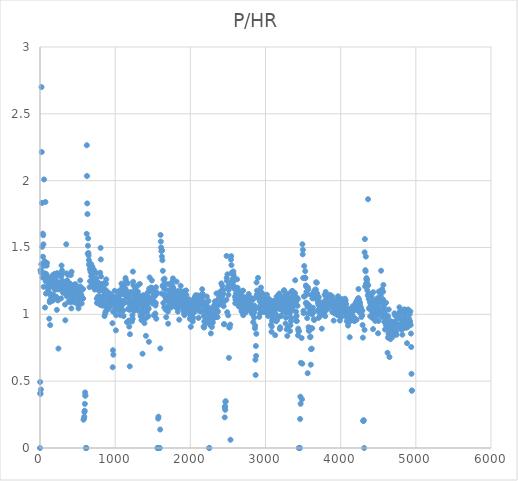
| Category | P/HR |
|---|---|
| 0.0 | 0 |
| 1.70000004768 | 0.494 |
| 3.40000009537 | 0.41 |
| 7.0 | 0.405 |
| 8.0 | 1.329 |
| 10.0 | 1.329 |
| 12.0 | 1.312 |
| 12.5999999046 | 0.438 |
| 17.0 | 1.375 |
| 19.7999999523 | 2.7 |
| 23.4000000954 | 2.214 |
| 26.5999999046 | 1.833 |
| 30.0 | 1.505 |
| 33.0999999046 | 1.276 |
| 36.2999999523 | 1.604 |
| 39.5999999046 | 1.431 |
| 42.4000000954 | 1.592 |
| 45.5999999046 | 1.524 |
| 48.5999999046 | 1.206 |
| 51.5999999046 | 1.364 |
| 54.4000000954 | 2.009 |
| 57.5999999046 | 1.366 |
| 60.5999999046 | 1.398 |
| 64.0 | 1.307 |
| 67.4000000954 | 1.051 |
| 72.0999999046 | 1.84 |
| 75.5999999046 | 1.248 |
| 79.2000000477 | 1.155 |
| 82.4000000954 | 1.302 |
| 85.5999999046 | 1.274 |
| 89.0 | 1.364 |
| 92.2000000477 | 1.385 |
| 95.5999999046 | 1.25 |
| 99.0 | 1.276 |
| 102.0 | 1.282 |
| 105.400000095 | 1.23 |
| 108.799999952 | 1.181 |
| 112.0 | 1.266 |
| 115.599999905 | 1.198 |
| 119.0 | 1.21 |
| 123.099999905 | 0.967 |
| 126.0 | 1.262 |
| 129.200000048 | 1.09 |
| 132.599999905 | 1.106 |
| 135.799999952 | 0.919 |
| 139.0 | 1.153 |
| 142.400000095 | 1.138 |
| 145.799999952 | 1.24 |
| 149.200000048 | 1.099 |
| 153.099999905 | 1.208 |
| 156.200000048 | 1.109 |
| 159.599999905 | 1.237 |
| 163.0 | 1.118 |
| 166.200000048 | 1.292 |
| 169.400000095 | 1.258 |
| 172.799999952 | 1.104 |
| 176.400000095 | 1.146 |
| 180.0 | 1.23 |
| 183.200000048 | 1.238 |
| 186.599999905 | 1.236 |
| 190.0 | 1.236 |
| 193.400000095 | 1.303 |
| 196.799999952 | 1.183 |
| 200.200000048 | 1.275 |
| 203.599999905 | 1.286 |
| 207.200000048 | 1.227 |
| 210.599999905 | 1.208 |
| 214.200000048 | 1.132 |
| 217.599999905 | 1.25 |
| 221.0 | 1.208 |
| 224.400000095 | 1.033 |
| 228.099999905 | 1.308 |
| 231.299999952 | 1.187 |
| 234.799999952 | 1.194 |
| 238.400000095 | 1.104 |
| 242.0 | 1.112 |
| 245.400000095 | 0.744 |
| 249.099999905 | 1.232 |
| 252.299999952 | 1.301 |
| 255.799999952 | 1.187 |
| 259.400000095 | 1.203 |
| 262.799999952 | 1.287 |
| 266.200000048 | 1.293 |
| 269.599999905 | 1.24 |
| 273.099999905 | 1.216 |
| 276.599999905 | 1.19 |
| 280.0 | 1.119 |
| 283.400000095 | 1.286 |
| 286.599999905 | 1.365 |
| 290.0 | 1.302 |
| 293.200000048 | 1.328 |
| 296.400000095 | 1.308 |
| 300.099999905 | 1.25 |
| 303.200000048 | 1.218 |
| 306.400000095 | 1.163 |
| 309.799999952 | 1.244 |
| 313.200000048 | 1.163 |
| 316.599999905 | 1.163 |
| 319.799999952 | 1.17 |
| 323.200000048 | 1.243 |
| 326.400000095 | 1.222 |
| 330.099999905 | 1.199 |
| 333.299999952 | 1.074 |
| 336.799999952 | 0.956 |
| 340.200000048 | 1.173 |
| 343.799999952 | 1.173 |
| 343.799999952 | 1.185 |
| 343.799999952 | 1.185 |
| 349.400000095 | 1.524 |
| 352.599999905 | 1.306 |
| 355.799999952 | 1.135 |
| 358.799999952 | 1.213 |
| 362.200000048 | 1.254 |
| 365.599999905 | 1.192 |
| 369.099999905 | 1.143 |
| 372.599999905 | 1.296 |
| 376.0 | 1.175 |
| 379.400000095 | 1.094 |
| 382.799999952 | 1.141 |
| 386.0 | 1.188 |
| 389.599999905 | 1.155 |
| 393.099999905 | 1.18 |
| 396.200000048 | 1.101 |
| 399.599999905 | 1.231 |
| 403.0 | 1.168 |
| 406.400000095 | 1.099 |
| 407.700000048 | 1.099 |
| 409.0 | 1.091 |
| 410.200000048 | 1.293 |
| 413.599999905 | 1.194 |
| 417.099999905 | 1.044 |
| 420.099999905 | 1.319 |
| 423.299999952 | 1.207 |
| 426.400000095 | 1.148 |
| 429.599999905 | 1.141 |
| 433.0 | 1.141 |
| 436.200000048 | 1.11 |
| 439.400000095 | 1.163 |
| 442.799999952 | 1.134 |
| 446.200000048 | 1.159 |
| 449.599999905 | 1.098 |
| 453.099999905 | 1.216 |
| 456.299999952 | 1.09 |
| 459.599999905 | 1.222 |
| 462.799999952 | 1.222 |
| 466.299999952 | 1.206 |
| 469.400000095 | 1.197 |
| 472.799999952 | 1.225 |
| 476.0 | 1.165 |
| 479.299999952 | 1.144 |
| 482.599999905 | 1.194 |
| 486.099999905 | 1.171 |
| 489.200000048 | 1.137 |
| 492.400000095 | 1.209 |
| 495.799999952 | 1.18 |
| 499.099999905 | 1.094 |
| 502.400000095 | 1.072 |
| 505.700000048 | 1.188 |
| 509.0 | 1.139 |
| 512.5 | 1.044 |
| 515.599999905 | 1.119 |
| 519.099999905 | 1.083 |
| 522.200000048 | 1.075 |
| 525.599999905 | 1.127 |
| 528.799999952 | 1.127 |
| 532.099999905 | 1.172 |
| 535.200000048 | 1.254 |
| 538.5 | 1.207 |
| 541.599999905 | 1.156 |
| 544.900000095 | 1.132 |
| 548.0 | 1.119 |
| 551.5 | 1.141 |
| 554.599999905 | 1.081 |
| 558.099999905 | 1.119 |
| 558.099999905 | 1.119 |
| 558.099999905 | 1.119 |
| 572.599999905 | 1.119 |
| 572.599999905 | 1.119 |
| 572.599999905 | 1.189 |
| 579.200000048 | 0.212 |
| 585.200000048 | 0.22 |
| 589.0 | 0.234 |
| 591.0 | 0.269 |
| 594.400000095 | 0.279 |
| 596.700000048 | 0.33 |
| 600.599999905 | 0.416 |
| 602.599999905 | 0.392 |
| 604.200000048 | 0.392 |
| 611.0 | 0 |
| 612.0 | 0 |
| 616.650000095 | 0 |
| 621.299999952 | 1.602 |
| 623.099999905 | 2.265 |
| 624.900000095 | 2.035 |
| 628.099999905 | 1.83 |
| 631.299999952 | 1.75 |
| 634.900000095 | 1.455 |
| 637.900000095 | 1.513 |
| 641.0 | 1.568 |
| 644.099999905 | 1.459 |
| 647.200000048 | 1.44 |
| 650.299999952 | 1.406 |
| 653.5 | 1.369 |
| 656.700000048 | 1.379 |
| 659.900000095 | 1.203 |
| 663.099999905 | 1.338 |
| 666.099999905 | 1.248 |
| 669.099999905 | 1.366 |
| 672.099999905 | 1.319 |
| 675.299999952 | 1.35 |
| 678.299999952 | 1.377 |
| 681.5 | 1.286 |
| 684.5 | 1.31 |
| 687.700000048 | 1.215 |
| 690.700000048 | 1.352 |
| 693.700000048 | 1.359 |
| 696.900000095 | 1.349 |
| 700.099999905 | 1.299 |
| 703.099999905 | 1.25 |
| 706.299999952 | 1.255 |
| 709.299999952 | 1.336 |
| 712.299999952 | 1.26 |
| 715.299999952 | 1.333 |
| 718.5 | 1.225 |
| 721.299999952 | 1.265 |
| 724.5 | 1.199 |
| 727.5 | 1.185 |
| 730.5 | 1.211 |
| 733.5 | 1.224 |
| 736.5 | 1.25 |
| 739.5 | 1.229 |
| 742.5 | 1.261 |
| 746.0 | 1.237 |
| 749.0 | 1.268 |
| 752.0 | 1.309 |
| 755.0 | 1.118 |
| 758.0 | 1.085 |
| 761.0 | 1.19 |
| 764.0 | 1.243 |
| 767.099999905 | 1.125 |
| 770.099999905 | 1.132 |
| 773.200000048 | 1.184 |
| 776.299999952 | 1.183 |
| 779.5 | 1.124 |
| 782.5 | 1.196 |
| 785.700000048 | 1.175 |
| 788.700000048 | 1.136 |
| 791.700000048 | 1.182 |
| 794.700000048 | 1.221 |
| 797.700000048 | 1.072 |
| 800.5 | 1.311 |
| 803.5 | 1.219 |
| 806.299999952 | 1.497 |
| 809.0 | 1.411 |
| 812.0 | 1.283 |
| 815.0 | 1.229 |
| 818.0 | 1.097 |
| 821.0 | 1.181 |
| 824.099999905 | 1.109 |
| 827.099999905 | 1.194 |
| 830.299999952 | 1.065 |
| 833.299999952 | 1.219 |
| 836.5 | 1.097 |
| 839.5 | 1.2 |
| 842.700000048 | 1.096 |
| 845.900000095 | 1.135 |
| 849.099999905 | 1.141 |
| 852.299999952 | 1.232 |
| 855.299999952 | 1.167 |
| 858.5 | 0.987 |
| 861.700000048 | 1.064 |
| 864.900000095 | 1.083 |
| 868.099999905 | 1.006 |
| 871.299999952 | 1.019 |
| 874.5 | 1.182 |
| 878.0 | 1.229 |
| 881.0 | 1.261 |
| 884.099999905 | 1.092 |
| 887.299999952 | 1.033 |
| 890.5 | 1.137 |
| 893.900000095 | 1.072 |
| 896.900000095 | 1.105 |
| 900.099999905 | 1.078 |
| 903.299999952 | 1.163 |
| 906.5 | 1.039 |
| 909.700000048 | 1.162 |
| 912.700000048 | 1.097 |
| 915.900000095 | 1.118 |
| 919.099999905 | 1.118 |
| 922.299999952 | 1.111 |
| 925.5 | 1.078 |
| 929.0 | 1.072 |
| 932.0 | 1.092 |
| 935.099999905 | 1.059 |
| 938.200000048 | 1.098 |
| 941.299999952 | 1.15 |
| 944.5 | 1.105 |
| 947.700000048 | 1.131 |
| 950.900000095 | 1.099 |
| 954.099999905 | 1.093 |
| 957.299999952 | 1.067 |
| 960.700000048 | 1.134 |
| 963.900000095 | 0.933 |
| 967.299999952 | 0.604 |
| 970.299999952 | 0.732 |
| 973.299999952 | 1.02 |
| 976.5 | 0.698 |
| 980.0 | 1.081 |
| 983.200000048 | 1.095 |
| 986.5 | 1.109 |
| 989.700000048 | 1.027 |
| 992.900000095 | 1.176 |
| 996.099999905 | 1.122 |
| 999.5 | 1.128 |
| 1002.70000005 | 1.108 |
| 1005.9000001 | 1.04 |
| 1009.0999999 | 0.88 |
| 1012.5 | 0.993 |
| 1016.0 | 1.101 |
| 1019.0 | 1.06 |
| 1022.20000005 | 1.114 |
| 1025.5 | 1.094 |
| 1028.70000005 | 1.121 |
| 1031.9000001 | 1.107 |
| 1035.0999999 | 1.141 |
| 1038.29999995 | 1.169 |
| 1041.70000005 | 1.054 |
| 1044.9000001 | 1.141 |
| 1048.0999999 | 1.121 |
| 1051.29999995 | 1.04 |
| 1054.5 | 1.027 |
| 1058.0 | 1.177 |
| 1061.0 | 1.075 |
| 1064.29999995 | 1.171 |
| 1067.5 | 1.075 |
| 1070.70000005 | 0.993 |
| 1073.9000001 | 1.103 |
| 1077.0999999 | 1.15 |
| 1080.29999995 | 1.048 |
| 1083.5 | 1.23 |
| 1086.70000005 | 1.101 |
| 1089.9000001 | 1.067 |
| 1093.0999999 | 1.073 |
| 1096.29999995 | 1.2 |
| 1099.5 | 1.207 |
| 1103.0 | 1.173 |
| 1106.0 | 1.027 |
| 1109.0999999 | 1.1 |
| 1112.29999995 | 0.987 |
| 1115.5999999 | 1.207 |
| 1118.70000005 | 1.174 |
| 1121.9000001 | 1.148 |
| 1125.0999999 | 1.148 |
| 1128.4000001 | 1.087 |
| 1131.5 | 1.173 |
| 1134.79999995 | 1.193 |
| 1137.9000001 | 1.272 |
| 1141.20000005 | 1.257 |
| 1144.5 | 1.237 |
| 1148.0 | 1.158 |
| 1151.0 | 1.144 |
| 1154.0999999 | 1.123 |
| 1157.5 | 0.942 |
| 1160.79999995 | 1.171 |
| 1163.9000001 | 1.139 |
| 1167.20000005 | 1.232 |
| 1170.70000005 | 1.04 |
| 1174.20000005 | 0.947 |
| 1177.29999995 | 1.139 |
| 1181.0 | 1.086 |
| 1184.0 | 0.954 |
| 1187.29999995 | 0.908 |
| 1190.70000005 | 1.033 |
| 1193.9000001 | 0.611 |
| 1197.20000005 | 0.851 |
| 1200.4000001 | 1.06 |
| 1203.5999999 | 1.107 |
| 1206.70000005 | 1.053 |
| 1210.0 | 1.167 |
| 1213.20000005 | 1.066 |
| 1216.4000001 | 1.053 |
| 1219.5999999 | 1.08 |
| 1223.0 | 0.947 |
| 1226.0999999 | 1.047 |
| 1229.4000001 | 0.993 |
| 1232.79999995 | 0.966 |
| 1236.0 | 1.32 |
| 1239.20000005 | 1.243 |
| 1242.5999999 | 1.216 |
| 1245.79999995 | 1.134 |
| 1249.20000005 | 1.086 |
| 1252.5999999 | 1.026 |
| 1256.0 | 1.145 |
| 1259.0 | 1.171 |
| 1262.5999999 | 1.112 |
| 1266.0 | 1.192 |
| 1269.20000005 | 1.145 |
| 1272.5999999 | 1.079 |
| 1276.0 | 1.205 |
| 1279.20000005 | 1.178 |
| 1282.5 | 1.052 |
| 1285.5999999 | 1.137 |
| 1289.0 | 1.138 |
| 1292.4000001 | 1.059 |
| 1295.79999995 | 1.105 |
| 1299.0 | 1.216 |
| 1302.20000005 | 1.169 |
| 1305.4000001 | 1.117 |
| 1308.79999995 | 1.071 |
| 1312.0 | 1.026 |
| 1315.20000005 | 1.097 |
| 1318.4000001 | 1.124 |
| 1321.5999999 | 1.098 |
| 1325.0 | 1.078 |
| 1328.0 | 1.227 |
| 1331.4000001 | 1.136 |
| 1334.5999999 | 1.123 |
| 1337.79999995 | 0.987 |
| 1341.0 | 1.071 |
| 1344.4000001 | 1.076 |
| 1347.5999999 | 1.064 |
| 1350.79999995 | 0.956 |
| 1353.79999995 | 1.127 |
| 1357.20000005 | 1.013 |
| 1360.4000001 | 1 |
| 1364.0 | 0.705 |
| 1367.0 | 0.962 |
| 1370.0 | 1.039 |
| 1373.0999999 | 1.058 |
| 1376.4000001 | 1.144 |
| 1379.4000001 | 1.033 |
| 1382.5999999 | 1.132 |
| 1386.0 | 1.039 |
| 1389.20000005 | 0.934 |
| 1392.5999999 | 1.026 |
| 1395.5999999 | 1.092 |
| 1399.0 | 1.112 |
| 1402.20000005 | 1.107 |
| 1405.5999999 | 1.054 |
| 1409.0 | 0.839 |
| 1412.0999999 | 0.973 |
| 1415.5999999 | 1.014 |
| 1419.0 | 1.014 |
| 1422.20000005 | 1.074 |
| 1425.79999995 | 1.087 |
| 1429.0 | 1.054 |
| 1432.4000001 | 1.162 |
| 1435.5999999 | 1.128 |
| 1439.0 | 1.047 |
| 1442.4000001 | 0.986 |
| 1445.5999999 | 1.041 |
| 1448.79999995 | 0.795 |
| 1452.0 | 1.192 |
| 1455.4000001 | 1.11 |
| 1458.5999999 | 1.276 |
| 1461.79999995 | 1.11 |
| 1465.0 | 1.171 |
| 1468.4000001 | 1.123 |
| 1472.0 | 1.11 |
| 1475.0 | 1.11 |
| 1478.5999999 | 1.2 |
| 1481.79999995 | 1.193 |
| 1485.0 | 1.186 |
| 1488.4000001 | 1.253 |
| 1491.5999999 | 1.197 |
| 1494.79999995 | 1.081 |
| 1498.0 | 1.115 |
| 1501.20000005 | 1.107 |
| 1504.4000001 | 1.087 |
| 1508.0 | 1.134 |
| 1511.0 | 1.173 |
| 1514.20000005 | 0.993 |
| 1517.5999999 | 1.147 |
| 1520.79999995 | 1.16 |
| 1524.0 | 1.086 |
| 1527.4000001 | 0.993 |
| 1530.5999999 | 1.138 |
| 1533.79999995 | 1.007 |
| 1537.0 | 1.066 |
| 1540.20000005 | 1.086 |
| 1543.5999999 | 1.203 |
| 1547.0 | 0.967 |
| 1550.0 | 1.156 |
| 1553.0999999 | 1.156 |
| 1553.0999999 | 1.156 |
| 1553.0999999 | 1.163 |
| 1563.29999995 | 0 |
| 1564.5 | 0 |
| 1565.70000005 | 0 |
| 1566.70000005 | 0 |
| 1569.5 | 0 |
| 1572.5 | 0.22 |
| 1576.0999999 | 0.234 |
| 1589.5 | 0 |
| 1594.3499999 | 0 |
| 1599.20000005 | 0.138 |
| 1600.20000005 | 0.745 |
| 1604.0 | 1.594 |
| 1607.5999999 | 1.545 |
| 1611.0 | 1.5 |
| 1614.4000001 | 1.473 |
| 1617.79999995 | 1.155 |
| 1621.0 | 1.432 |
| 1624.4000001 | 1.479 |
| 1627.9000001 | 1.405 |
| 1631.0 | 1.211 |
| 1634.20000005 | 1.325 |
| 1637.5999999 | 1.219 |
| 1640.79999995 | 1.085 |
| 1644.0 | 1.26 |
| 1647.20000005 | 1.212 |
| 1650.4000001 | 1.194 |
| 1653.79999995 | 1.052 |
| 1656.79999995 | 1.267 |
| 1660.20000005 | 1.147 |
| 1663.4000001 | 1.131 |
| 1666.4000001 | 1.232 |
| 1669.9000001 | 1.036 |
| 1672.9000001 | 1.184 |
| 1675.9000001 | 1.113 |
| 1679.0999999 | 0.979 |
| 1682.20000005 | 1.105 |
| 1685.4000001 | 1.139 |
| 1688.5999999 | 1.118 |
| 1692.0 | 1.042 |
| 1695.0 | 1.126 |
| 1698.4000001 | 1.056 |
| 1701.5999999 | 1.021 |
| 1705.0 | 0.93 |
| 1708.0 | 1.225 |
| 1711.4000001 | 1.12 |
| 1714.9000001 | 1.063 |
| 1717.9000001 | 1.092 |
| 1721.0999999 | 1.134 |
| 1724.20000005 | 1.105 |
| 1727.4000001 | 1.168 |
| 1730.5999999 | 1.183 |
| 1733.79999995 | 1.077 |
| 1737.0 | 1.049 |
| 1740.4000001 | 1.084 |
| 1743.5999999 | 1.154 |
| 1746.79999995 | 1.077 |
| 1750.0 | 1.077 |
| 1753.20000005 | 1.239 |
| 1756.4000001 | 1.211 |
| 1759.9000001 | 1.217 |
| 1762.9000001 | 1.189 |
| 1766.0 | 1.146 |
| 1769.0999999 | 1.269 |
| 1772.4000001 | 1.199 |
| 1775.5999999 | 1.155 |
| 1778.5999999 | 1.188 |
| 1781.79999995 | 1.155 |
| 1785.20000005 | 1.122 |
| 1788.4000001 | 1.101 |
| 1791.5999999 | 1.141 |
| 1794.79999995 | 1.068 |
| 1798.0 | 1.088 |
| 1801.20000005 | 1.143 |
| 1804.9000001 | 1.054 |
| 1807.9000001 | 1.136 |
| 1811.0999999 | 1.088 |
| 1814.20000005 | 1.054 |
| 1817.20000005 | 1.245 |
| 1820.5999999 | 1.102 |
| 1823.5999999 | 1.156 |
| 1826.79999995 | 1.088 |
| 1830.0 | 1.121 |
| 1833.20000005 | 1.02 |
| 1836.4000001 | 1.128 |
| 1839.5999999 | 1.174 |
| 1842.79999995 | 1.087 |
| 1846.0 | 1.114 |
| 1849.29999995 | 1.054 |
| 1852.4000001 | 0.96 |
| 1855.9000001 | 1.147 |
| 1858.9000001 | 1.1 |
| 1861.9000001 | 1.094 |
| 1865.0999999 | 1.128 |
| 1868.29999995 | 1.127 |
| 1871.20000005 | 1.213 |
| 1874.5 | 1.173 |
| 1877.5999999 | 1.067 |
| 1880.5999999 | 1.113 |
| 1883.79999995 | 1.16 |
| 1887.0 | 1.153 |
| 1890.0 | 1.113 |
| 1893.20000005 | 1.133 |
| 1896.4000001 | 1.073 |
| 1899.5999999 | 1.159 |
| 1902.79999995 | 1.1 |
| 1906.0 | 1.033 |
| 1909.0 | 1.113 |
| 1912.20000005 | 1.093 |
| 1915.4000001 | 1.007 |
| 1918.9000001 | 1.173 |
| 1921.9000001 | 0.993 |
| 1925.0 | 1.04 |
| 1928.20000005 | 1.106 |
| 1931.4000001 | 1.06 |
| 1934.5999999 | 1.113 |
| 1937.79999995 | 1.099 |
| 1941.20000005 | 1.093 |
| 1944.4000001 | 1.179 |
| 1947.70000005 | 1.145 |
| 1950.79999995 | 1.092 |
| 1954.0999999 | 1.032 |
| 1957.20000005 | 1.065 |
| 1960.4000001 | 1.045 |
| 1963.9000001 | 1.026 |
| 1966.9000001 | 1.059 |
| 1970.0999999 | 1.059 |
| 1973.29999995 | 1.053 |
| 1976.5999999 | 1.046 |
| 1979.70000005 | 1.059 |
| 1983.0 | 1.112 |
| 1986.29999995 | 1.06 |
| 1989.5 | 1 |
| 1992.70000005 | 0.966 |
| 1996.0 | 1.088 |
| 1999.29999995 | 1.02 |
| 2002.4000001 | 1.067 |
| 2005.9000001 | 0.907 |
| 2008.9000001 | 1.053 |
| 2011.9000001 | 1.073 |
| 2015.0999999 | 1.033 |
| 2018.5 | 1.06 |
| 2021.9000001 | 1.054 |
| 2025.0999999 | 1.101 |
| 2028.29999995 | 0.98 |
| 2031.70000005 | 0.946 |
| 2034.70000005 | 1.107 |
| 2038.0999999 | 0.973 |
| 2041.5 | 1.054 |
| 2044.9000001 | 1.027 |
| 2047.9000001 | 1.014 |
| 2051.29999995 | 1.068 |
| 2054.5 | 1.041 |
| 2057.70000005 | 1.068 |
| 2060.9000001 | 1.13 |
| 2064.29999995 | 1.082 |
| 2067.5 | 1.041 |
| 2070.70000005 | 1.143 |
| 2073.9000001 | 1.108 |
| 2077.0999999 | 1.115 |
| 2080.29999995 | 1.115 |
| 2083.5 | 1.074 |
| 2086.9000001 | 1.074 |
| 2090.0 | 1.054 |
| 2093.29999995 | 1.088 |
| 2096.5 | 1.142 |
| 2099.70000005 | 1.101 |
| 2102.9000001 | 1.101 |
| 2106.0999999 | 1.081 |
| 2109.29999995 | 0.973 |
| 2112.70000005 | 1.027 |
| 2115.9000001 | 1.054 |
| 2119.29999995 | 1.116 |
| 2122.5 | 1.109 |
| 2125.9000001 | 1.135 |
| 2128.9000001 | 1.101 |
| 2132.0 | 1.061 |
| 2135.29999995 | 1.081 |
| 2138.70000005 | 1.02 |
| 2141.9000001 | 1.073 |
| 2145.0999999 | 1.087 |
| 2148.29999995 | 1.146 |
| 2151.5 | 1.127 |
| 2154.70000005 | 1.073 |
| 2157.70000005 | 1.188 |
| 2160.9000001 | 1.153 |
| 2164.29999995 | 1.147 |
| 2167.5 | 1.087 |
| 2170.9000001 | 1.099 |
| 2173.9000001 | 1.026 |
| 2177.0 | 0.908 |
| 2180.0999999 | 0.987 |
| 2183.5 | 0.901 |
| 2186.70000005 | 0.947 |
| 2190.0999999 | 1.026 |
| 2193.29999995 | 0.947 |
| 2196.5 | 1.033 |
| 2199.70000005 | 1.059 |
| 2202.9000001 | 0.934 |
| 2206.0999999 | 1.072 |
| 2209.29999995 | 1.079 |
| 2212.5 | 1.046 |
| 2215.9000001 | 1.033 |
| 2218.9000001 | 1.133 |
| 2222.0 | 1.04 |
| 2225.29999995 | 0.96 |
| 2228.29999995 | 1.013 |
| 2231.5 | 1.027 |
| 2234.9000001 | 0.966 |
| 2238.0999999 | 1.053 |
| 2241.29999995 | 1.1 |
| 2244.70000005 | 1.007 |
| 2247.9000001 | 1.04 |
| 2251.29999995 | 0 |
| 2251.29999995 | 0 |
| 2251.29999995 | 1 |
| 2257.29999995 | 1.007 |
| 2260.5 | 0.926 |
| 2263.5 | 0.98 |
| 2266.9000001 | 0.918 |
| 2269.9000001 | 1 |
| 2273.29999995 | 0.857 |
| 2276.5 | 1.007 |
| 2279.70000005 | 1 |
| 2283.0999999 | 0.94 |
| 2286.5 | 0.905 |
| 2289.70000005 | 1.014 |
| 2292.9000001 | 0.98 |
| 2296.0999999 | 1.02 |
| 2299.29999995 | 0.939 |
| 2302.9000001 | 1.054 |
| 2305.9000001 | 0.986 |
| 2309.0999999 | 1.014 |
| 2312.5 | 1.014 |
| 2315.70000005 | 0.973 |
| 2318.9000001 | 1.068 |
| 2322.0999999 | 1.007 |
| 2325.5 | 0.986 |
| 2328.70000005 | 1.097 |
| 2332.0999999 | 1.097 |
| 2335.5 | 1.021 |
| 2338.9000001 | 1.02 |
| 2341.9000001 | 1.081 |
| 2345.0999999 | 0.98 |
| 2348.29999995 | 1.156 |
| 2351.70000005 | 1.034 |
| 2354.9000001 | 1.061 |
| 2358.0999999 | 1.02 |
| 2361.5 | 0.98 |
| 2364.70000005 | 1.095 |
| 2367.9000001 | 1.021 |
| 2371.0999999 | 1.083 |
| 2374.29999995 | 1.076 |
| 2377.5 | 1.104 |
| 2380.9000001 | 1.124 |
| 2384.0999999 | 1.116 |
| 2387.5 | 1.095 |
| 2390.70000005 | 1.149 |
| 2393.70000005 | 1.081 |
| 2396.9000001 | 1.169 |
| 2399.9000001 | 1.134 |
| 2402.9000001 | 1.074 |
| 2405.9000001 | 1.135 |
| 2409.0999999 | 1.15 |
| 2412.29999995 | 1.231 |
| 2415.29999995 | 1.103 |
| 2418.5 | 1.131 |
| 2421.5 | 1.179 |
| 2424.70000005 | 1.214 |
| 2427.70000005 | 1.143 |
| 2430.9000001 | 1.177 |
| 2433.9000001 | 1.184 |
| 2437.0999999 | 1.156 |
| 2440.29999995 | 1.088 |
| 2443.5 | 1.061 |
| 2446.9000001 | 0.926 |
| 2452.04999995 | 0.926 |
| 2457.20000005 | 0.229 |
| 2458.70000005 | 0.306 |
| 2460.3499999 | 0.306 |
| 2462.0 | 0.312 |
| 2464.4000001 | 0.286 |
| 2467.4000001 | 0.345 |
| 2469.5999999 | 0.35 |
| 2480.4000001 | 1.109 |
| 2482.20000005 | 1.437 |
| 2484.0 | 1.273 |
| 2487.4000001 | 1.25 |
| 2490.5999999 | 1.016 |
| 2493.79999995 | 1.299 |
| 2497.0 | 1.195 |
| 2500.20000005 | 1.209 |
| 2503.9000001 | 0.992 |
| 2506.79999995 | 1.146 |
| 2510.0999999 | 1.183 |
| 2513.4000001 | 0.674 |
| 2516.5999999 | 0.902 |
| 2523.70000005 | 0.902 |
| 2530.79999995 | 0.923 |
| 2534.0 | 0.062 |
| 2537.20000005 | 1.232 |
| 2540.5999999 | 1.41 |
| 2543.79999995 | 1.435 |
| 2547.0 | 1.368 |
| 2550.20000005 | 1.238 |
| 2553.4000001 | 1.312 |
| 2556.4000001 | 1.302 |
| 2559.79999995 | 1.262 |
| 2563.0 | 1.237 |
| 2566.0 | 1.205 |
| 2569.4000001 | 1.308 |
| 2572.79999995 | 1.321 |
| 2575.79999995 | 1.294 |
| 2578.79999995 | 1.21 |
| 2581.79999995 | 1.273 |
| 2584.9000001 | 1.255 |
| 2588.20000005 | 1.19 |
| 2591.4000001 | 1.196 |
| 2594.4000001 | 1.132 |
| 2597.5999999 | 1.083 |
| 2600.5999999 | 1.109 |
| 2603.5999999 | 1.122 |
| 2606.79999995 | 1.151 |
| 2610.0 | 1.13 |
| 2613.0 | 1.199 |
| 2616.20000005 | 1.163 |
| 2619.20000005 | 1.189 |
| 2622.4000001 | 1.262 |
| 2625.5999999 | 1.193 |
| 2628.5999999 | 1.199 |
| 2631.5999999 | 1.092 |
| 2634.5999999 | 1.144 |
| 2637.79999995 | 1.175 |
| 2640.79999995 | 1.123 |
| 2644.0 | 1.065 |
| 2647.0 | 1.058 |
| 2650.0 | 1.13 |
| 2653.20000005 | 1.129 |
| 2656.20000005 | 1.115 |
| 2659.20000005 | 1.148 |
| 2662.20000005 | 1.149 |
| 2665.4000001 | 1.123 |
| 2668.79999995 | 1.078 |
| 2671.79999995 | 1.11 |
| 2674.79999995 | 1.111 |
| 2677.79999995 | 1.053 |
| 2681.0999999 | 1.026 |
| 2684.4000001 | 1.02 |
| 2687.5999999 | 1.132 |
| 2690.79999995 | 1.066 |
| 2693.79999995 | 1.118 |
| 2697.0 | 1.176 |
| 2700.20000005 | 1.176 |
| 2703.5999999 | 0.993 |
| 2706.5999999 | 1.132 |
| 2709.79999995 | 1.086 |
| 2713.0 | 1.059 |
| 2716.20000005 | 1.072 |
| 2719.4000001 | 1.118 |
| 2722.9000001 | 1.052 |
| 2725.9000001 | 1.052 |
| 2728.9000001 | 1.078 |
| 2732.20000005 | 1.072 |
| 2735.4000001 | 1.013 |
| 2738.5999999 | 1.053 |
| 2742.0 | 1.06 |
| 2745.20000005 | 1.053 |
| 2748.20000005 | 1.026 |
| 2751.4000001 | 1.053 |
| 2754.5999999 | 1.099 |
| 2757.79999995 | 1.132 |
| 2761.0 | 1.06 |
| 2764.20000005 | 1.046 |
| 2767.20000005 | 1.113 |
| 2770.4000001 | 1.12 |
| 2773.9000001 | 1.073 |
| 2776.9000001 | 1.152 |
| 2780.0999999 | 1.073 |
| 2783.20000005 | 1.119 |
| 2786.4000001 | 1.099 |
| 2789.5999999 | 1.099 |
| 2792.5999999 | 1.111 |
| 2795.79999995 | 1.124 |
| 2799.0 | 1.032 |
| 2802.20000005 | 1.077 |
| 2805.4000001 | 1.117 |
| 2808.5999999 | 1.058 |
| 2811.79999995 | 1.104 |
| 2815.0 | 1.065 |
| 2818.20000005 | 1.052 |
| 2821.4000001 | 1.006 |
| 2824.4000001 | 1.013 |
| 2827.9000001 | 1 |
| 2830.9000001 | 1.118 |
| 2834.0999999 | 1.111 |
| 2837.20000005 | 0.941 |
| 2840.20000005 | 1.013 |
| 2843.4000001 | 1.013 |
| 2846.5999999 | 1.02 |
| 2849.79999995 | 0.974 |
| 2853.0 | 1.066 |
| 2856.20000005 | 1.039 |
| 2859.4000001 | 0.895 |
| 2862.5999999 | 0.915 |
| 2865.79999995 | 0.66 |
| 2869.0 | 0.546 |
| 2872.0 | 0.763 |
| 2875.0 | 0.689 |
| 2878.0 | 0.854 |
| 2881.20000005 | 1.238 |
| 2884.4000001 | 1.145 |
| 2887.9000001 | 1.178 |
| 2890.9000001 | 1.151 |
| 2894.20000005 | 1.124 |
| 2897.4000001 | 1.131 |
| 2900.4000001 | 1.273 |
| 2903.5999999 | 1.168 |
| 2907.0 | 1.129 |
| 2910.20000005 | 1.129 |
| 2913.4000001 | 1.045 |
| 2916.79999995 | 0.981 |
| 2920.0 | 1.058 |
| 2923.20000005 | 1.097 |
| 2926.4000001 | 1.006 |
| 2929.9000001 | 1.039 |
| 2932.9000001 | 1.112 |
| 2936.20000005 | 1.126 |
| 2939.5999999 | 1.2 |
| 2942.79999995 | 1.127 |
| 2946.0 | 1.166 |
| 2949.20000005 | 1.02 |
| 2952.4000001 | 1.097 |
| 2955.5999999 | 1.058 |
| 2958.79999995 | 1.077 |
| 2962.0 | 1.019 |
| 2965.20000005 | 1.115 |
| 2968.20000005 | 1.108 |
| 2971.4000001 | 1.146 |
| 2974.9000001 | 1.115 |
| 2977.9000001 | 1.115 |
| 2980.9000001 | 1.019 |
| 2984.0 | 1.101 |
| 2987.0999999 | 1.075 |
| 2990.4000001 | 1.094 |
| 2993.5999999 | 1.019 |
| 2996.79999995 | 1.108 |
| 2999.79999995 | 1.089 |
| 3003.0 | 1.051 |
| 3006.20000005 | 1.096 |
| 3009.4000001 | 1.108 |
| 3012.5999999 | 1.064 |
| 3015.79999995 | 1.013 |
| 3019.0 | 1.146 |
| 3022.0 | 1.083 |
| 3025.20000005 | 1.071 |
| 3028.4000001 | 1.064 |
| 3031.9000001 | 1.051 |
| 3034.9000001 | 0.987 |
| 3038.0 | 1.045 |
| 3041.20000005 | 1.038 |
| 3044.5999999 | 1.032 |
| 3047.79999995 | 1.115 |
| 3051.0 | 1.108 |
| 3054.20000005 | 1.032 |
| 3057.4000001 | 1 |
| 3060.5 | 1.089 |
| 3063.5999999 | 1.045 |
| 3066.79999995 | 1.064 |
| 3070.0 | 1.026 |
| 3073.29999995 | 0.923 |
| 3076.4000001 | 0.987 |
| 3079.9000001 | 0.869 |
| 3083.0 | 0.908 |
| 3086.29999995 | 0.954 |
| 3089.4000001 | 1.099 |
| 3092.5 | 1.053 |
| 3095.79999995 | 1.053 |
| 3099.0999999 | 0.967 |
| 3102.4000001 | 1.007 |
| 3105.9000001 | 1.072 |
| 3109.0 | 1.033 |
| 3112.29999995 | 1.046 |
| 3115.9000001 | 1.039 |
| 3118.9000001 | 1.033 |
| 3122.0 | 1.072 |
| 3125.5 | 1.033 |
| 3128.5999999 | 0.844 |
| 3131.70000005 | 1.105 |
| 3134.79999995 | 1.065 |
| 3137.9000001 | 1 |
| 3141.0 | 0.948 |
| 3144.20000005 | 1.072 |
| 3147.5 | 1.132 |
| 3150.70000005 | 0.954 |
| 3153.5999999 | 1.116 |
| 3156.79999995 | 0.981 |
| 3159.9000001 | 0.968 |
| 3163.0 | 1.084 |
| 3166.0999999 | 1.143 |
| 3169.20000005 | 1.071 |
| 3172.4000001 | 1.098 |
| 3175.9000001 | 1.144 |
| 3178.9000001 | 1.137 |
| 3181.9000001 | 1.039 |
| 3185.0 | 1.156 |
| 3188.0999999 | 1.065 |
| 3191.20000005 | 0.89 |
| 3194.4000001 | 0.903 |
| 3197.70000005 | 1.065 |
| 3200.9000001 | 0.987 |
| 3203.9000001 | 1.097 |
| 3207.0999999 | 0.987 |
| 3210.0999999 | 1.083 |
| 3213.0999999 | 1.128 |
| 3216.29999995 | 1.058 |
| 3219.5 | 1.11 |
| 3222.70000005 | 1.052 |
| 3225.9000001 | 1.058 |
| 3229.0999999 | 1.026 |
| 3232.29999995 | 1.059 |
| 3235.5 | 1.092 |
| 3238.9000001 | 1.105 |
| 3241.9000001 | 1.02 |
| 3244.9000001 | 1.175 |
| 3247.9000001 | 1.181 |
| 3251.0999999 | 1.09 |
| 3254.0999999 | 1.057 |
| 3257.29999995 | 1.14 |
| 3260.29999995 | 1.082 |
| 3263.29999995 | 1.101 |
| 3266.5 | 0.931 |
| 3269.29999995 | 1.112 |
| 3272.29999995 | 0.975 |
| 3275.0 | 1.012 |
| 3278.0 | 1.019 |
| 3281.0 | 0.888 |
| 3283.9000001 | 1.031 |
| 3286.9000001 | 1.062 |
| 3289.9000001 | 0.839 |
| 3292.9000001 | 1.019 |
| 3295.9000001 | 1.062 |
| 3298.9000001 | 0.901 |
| 3301.9000001 | 1.154 |
| 3304.9000001 | 1.068 |
| 3307.5 | 1.074 |
| 3310.5 | 1.104 |
| 3313.9000001 | 1.118 |
| 3316.9000001 | 1.069 |
| 3319.9000001 | 1.05 |
| 3322.9000001 | 1.006 |
| 3326.0999999 | 0.875 |
| 3329.29999995 | 1.038 |
| 3332.29999995 | 0.918 |
| 3335.29999995 | 0.975 |
| 3338.5 | 0.949 |
| 3341.70000005 | 1.096 |
| 3344.9000001 | 1.077 |
| 3348.0999999 | 1.039 |
| 3351.29999995 | 1.174 |
| 3354.5 | 1.097 |
| 3357.5 | 1.103 |
| 3360.70000005 | 1.174 |
| 3363.70000005 | 1.135 |
| 3366.9000001 | 1.032 |
| 3369.9000001 | 1.096 |
| 3372.9000001 | 1.064 |
| 3376.0999999 | 1.09 |
| 3379.29999995 | 1.115 |
| 3382.5 | 1.134 |
| 3385.5 | 1.146 |
| 3388.9000001 | 1.134 |
| 3391.9000001 | 1.159 |
| 3394.9000001 | 1.255 |
| 3398.0 | 0.975 |
| 3401.0 | 1.127 |
| 3404.0999999 | 1.089 |
| 3407.29999995 | 1.019 |
| 3410.5 | 0.949 |
| 3413.70000005 | 0.987 |
| 3416.9000001 | 0.949 |
| 3419.9000001 | 1.121 |
| 3423.0999999 | 1.121 |
| 3426.29999995 | 1.064 |
| 3429.5 | 1.114 |
| 3432.5 | 0.843 |
| 3435.70000005 | 0.893 |
| 3438.9000001 | 0.881 |
| 3442.0999999 | 0.873 |
| 3442.0999999 | 0.873 |
| 3442.0999999 | 0 |
| 3453.9000001 | 0 |
| 3455.29999995 | 0 |
| 3456.70000005 | 0 |
| 3460.29999995 | 0.217 |
| 3464.0 | 0.384 |
| 3467.5 | 0.331 |
| 3470.9000001 | 0.637 |
| 3480.70000005 | 0.823 |
| 3485.54999995 | 0.365 |
| 3490.4000001 | 0.631 |
| 3491.0 | 1.524 |
| 3494.5999999 | 1.449 |
| 3498.0 | 1.482 |
| 3501.4000001 | 1.272 |
| 3504.79999995 | 1.026 |
| 3508.4000001 | 1.008 |
| 3512.0 | 1.134 |
| 3515.20000005 | 1.361 |
| 3518.5999999 | 1.133 |
| 3521.79999995 | 1.27 |
| 3525.0 | 1.274 |
| 3528.4000001 | 1.323 |
| 3531.79999995 | 1.271 |
| 3534.9000001 | 1.084 |
| 3538.0999999 | 1.216 |
| 3541.4000001 | 1.207 |
| 3544.5999999 | 1.168 |
| 3547.79999995 | 1.086 |
| 3551.20000005 | 1.15 |
| 3554.4000001 | 0.972 |
| 3557.5999999 | 1.056 |
| 3560.79999995 | 0.559 |
| 3563.79999995 | 1.201 |
| 3567.20000005 | 1.007 |
| 3570.0 | 1.186 |
| 3573.4000001 | 0.904 |
| 3576.20000005 | 0.878 |
| 3579.4000001 | 1.068 |
| 3582.79999995 | 0.878 |
| 3586.20000005 | 0.898 |
| 3589.5999999 | 0.891 |
| 3592.79999995 | 0.829 |
| 3595.79999995 | 1.034 |
| 3599.0 | 0.833 |
| 3602.79999995 | 0.623 |
| 3605.79999995 | 0.74 |
| 3608.5999999 | 1.145 |
| 3611.5999999 | 0.896 |
| 3614.79999995 | 0.743 |
| 3618.0 | 1 |
| 3621.20000005 | 0.895 |
| 3624.20000005 | 1.119 |
| 3627.4000001 | 1.014 |
| 3630.9000001 | 1.049 |
| 3634.0 | 1.014 |
| 3637.0999999 | 1.158 |
| 3640.4000001 | 1.151 |
| 3643.5999999 | 0.964 |
| 3647.0 | 0.957 |
| 3650.20000005 | 1.173 |
| 3653.4000001 | 1.174 |
| 3656.79999995 | 1.151 |
| 3660.20000005 | 1.184 |
| 3663.9000001 | 1.182 |
| 3666.9000001 | 1.132 |
| 3670.0999999 | 1.185 |
| 3673.20000005 | 1.24 |
| 3676.5999999 | 1.156 |
| 3679.79999995 | 1.149 |
| 3683.0 | 1.236 |
| 3686.20000005 | 1.107 |
| 3689.4000001 | 1.154 |
| 3692.5999999 | 1.027 |
| 3696.0 | 1.107 |
| 3699.20000005 | 1.087 |
| 3702.4000001 | 1.074 |
| 3705.9000001 | 0.973 |
| 3708.9000001 | 1.128 |
| 3712.20000005 | 1.068 |
| 3715.5999999 | 1.034 |
| 3718.79999995 | 1.041 |
| 3722.20000005 | 1.047 |
| 3725.5999999 | 0.987 |
| 3728.79999995 | 1 |
| 3732.20000005 | 1 |
| 3735.4000001 | 1.054 |
| 3738.9000001 | 1 |
| 3742.0999999 | 1.02 |
| 3745.4000001 | 1.074 |
| 3748.79999995 | 0.893 |
| 3752.0 | 1.088 |
| 3755.20000005 | 1.007 |
| 3758.4000001 | 1.007 |
| 3761.79999995 | 1.007 |
| 3765.0 | 1.02 |
| 3768.20000005 | 1.082 |
| 3771.4000001 | 1.082 |
| 3774.9000001 | 1.088 |
| 3778.0 | 1.075 |
| 3781.20000005 | 1.048 |
| 3784.5999999 | 1.055 |
| 3787.5999999 | 1.146 |
| 3791.0 | 1.021 |
| 3794.20000005 | 0.986 |
| 3797.4000001 | 1.104 |
| 3800.79999995 | 1.168 |
| 3804.0 | 1.07 |
| 3807.4000001 | 1.07 |
| 3810.9000001 | 1.126 |
| 3814.0 | 1.056 |
| 3817.20000005 | 1.076 |
| 3820.5999999 | 1.042 |
| 3823.79999995 | 1.097 |
| 3827.0 | 1.042 |
| 3830.4000001 | 1.076 |
| 3833.5999999 | 1.083 |
| 3836.79999995 | 1.062 |
| 3840.20000005 | 1.062 |
| 3843.4000001 | 1.111 |
| 3846.9000001 | 1.09 |
| 3849.9000001 | 1.139 |
| 3852.9000001 | 1.118 |
| 3856.0999999 | 1.145 |
| 3859.4000001 | 1.144 |
| 3862.5999999 | 1.122 |
| 3865.79999995 | 1.101 |
| 3869.20000005 | 1.061 |
| 3872.29999995 | 1.114 |
| 3875.4000001 | 1.101 |
| 3878.70000005 | 1.094 |
| 3881.79999995 | 1.074 |
| 3885.0999999 | 1.087 |
| 3888.20000005 | 1.02 |
| 3891.29999995 | 1.133 |
| 3894.4000001 | 1.053 |
| 3897.9000001 | 1.079 |
| 3900.9000001 | 1.013 |
| 3904.0 | 1.073 |
| 3907.20000005 | 0.953 |
| 3910.4000001 | 1.087 |
| 3913.5999999 | 1.013 |
| 3916.79999995 | 1.02 |
| 3920.20000005 | 1.061 |
| 3923.4000001 | 1.007 |
| 3926.70000005 | 1.007 |
| 3930.0999999 | 1.074 |
| 3933.29999995 | 1.075 |
| 3936.29999995 | 1.102 |
| 3939.5 | 1.02 |
| 3942.9000001 | 1.082 |
| 3946.0999999 | 1.048 |
| 3949.5 | 1.096 |
| 3952.5999999 | 1.11 |
| 3956.0999999 | 1.11 |
| 3959.20000005 | 1.061 |
| 3962.4000001 | 0.993 |
| 3965.70000005 | 1.135 |
| 3969.0999999 | 1.061 |
| 3972.29999995 | 0.993 |
| 3975.5 | 1.007 |
| 3978.9000001 | 1.087 |
| 3982.0 | 1.053 |
| 3985.29999995 | 1.107 |
| 3988.5 | 0.953 |
| 3991.70000005 | 1.06 |
| 3994.9000001 | 1.073 |
| 3998.29999995 | 1.053 |
| 4001.4000001 | 1.026 |
| 4004.70000005 | 1.007 |
| 4008.0999999 | 0.98 |
| 4011.29999995 | 1.114 |
| 4014.9000001 | 1.108 |
| 4017.9000001 | 1.041 |
| 4020.9000001 | 1.101 |
| 4024.0999999 | 1.04 |
| 4027.5 | 1.067 |
| 4030.70000005 | 1.013 |
| 4033.9000001 | 1.087 |
| 4037.0999999 | 1.073 |
| 4040.29999995 | 1.107 |
| 4043.5 | 1.107 |
| 4046.70000005 | 1.106 |
| 4049.9000001 | 1.092 |
| 4052.9000001 | 1.026 |
| 4056.0999999 | 1.117 |
| 4059.29999995 | 1.084 |
| 4062.5 | 1.065 |
| 4065.9000001 | 1.104 |
| 4068.9000001 | 1.006 |
| 4071.9000001 | 1.077 |
| 4075.29999995 | 0.987 |
| 4078.5 | 1.045 |
| 4081.70000005 | 0.948 |
| 4084.9000001 | 1.013 |
| 4088.0999999 | 0.968 |
| 4091.5 | 1.026 |
| 4094.70000005 | 0.987 |
| 4097.9000001 | 0.916 |
| 4101.0999999 | 0.987 |
| 4104.29999995 | 0.968 |
| 4107.5 | 1.013 |
| 4110.9000001 | 0.941 |
| 4113.9000001 | 1.013 |
| 4117.0 | 0.954 |
| 4120.29999995 | 0.829 |
| 4123.5 | 1.04 |
| 4126.70000005 | 1 |
| 4129.9000001 | 1.033 |
| 4133.29999995 | 0.961 |
| 4136.29999995 | 0.974 |
| 4139.70000005 | 1 |
| 4142.9000001 | 1.013 |
| 4146.29999995 | 1.007 |
| 4149.5 | 0.993 |
| 4152.9000001 | 1.027 |
| 4156.0 | 0.96 |
| 4159.0999999 | 1.06 |
| 4162.5 | 1.02 |
| 4165.70000005 | 0.959 |
| 4169.0999999 | 0.973 |
| 4172.29999995 | 0.959 |
| 4175.70000005 | 0.953 |
| 4179.0999999 | 0.953 |
| 4182.29999995 | 0.953 |
| 4185.5 | 0.973 |
| 4188.9000001 | 0.952 |
| 4191.9000001 | 1.055 |
| 4195.29999995 | 1.062 |
| 4198.5 | 1.083 |
| 4201.9000001 | 1.076 |
| 4205.0999999 | 1.089 |
| 4208.29999995 | 1.068 |
| 4211.5 | 0.959 |
| 4214.70000005 | 1.101 |
| 4217.9000001 | 1.034 |
| 4221.0999999 | 1.034 |
| 4224.5 | 1.082 |
| 4227.9000001 | 1.095 |
| 4230.9000001 | 1.116 |
| 4234.0999999 | 1.122 |
| 4237.29999995 | 1.189 |
| 4240.5 | 1.114 |
| 4243.70000005 | 1.107 |
| 4246.9000001 | 1.02 |
| 4250.0999999 | 1.093 |
| 4253.29999995 | 1.073 |
| 4256.5 | 1.086 |
| 4259.9000001 | 1.046 |
| 4263.0999999 | 1.059 |
| 4266.29999995 | 1.02 |
| 4269.29999995 | 1.007 |
| 4272.5 | 1.046 |
| 4275.9000001 | 0.98 |
| 4278.9000001 | 1.026 |
| 4281.9000001 | 0.993 |
| 4285.0999999 | 0.993 |
| 4288.5 | 1.027 |
| 4291.70000005 | 0.92 |
| 4295.5 | 0.826 |
| 4299.9000001 | 0.203 |
| 4303.4000001 | 0.203 |
| 4306.9000001 | 0.208 |
| 4312.1500001 | 0 |
| 4317.4000001 | 0.884 |
| 4318.5 | 1.464 |
| 4321.79999995 | 1.563 |
| 4325.29999995 | 1.209 |
| 4328.4000001 | 1.33 |
| 4331.9000001 | 1.322 |
| 4334.9000001 | 1.432 |
| 4337.9000001 | 1.228 |
| 4341.0999999 | 1.262 |
| 4344.5 | 1.271 |
| 4347.5999999 | 1.237 |
| 4350.9000001 | 1.258 |
| 4354.29999995 | 1.18 |
| 4357.5 | 1.216 |
| 4360.5999999 | 1.141 |
| 4364.0999999 | 1.861 |
| 4367.20000005 | 1.217 |
| 4370.4000001 | 1.159 |
| 4373.9000001 | 1.115 |
| 4376.9000001 | 1.043 |
| 4379.9000001 | 1.136 |
| 4383.0999999 | 1.05 |
| 4386.20000005 | 1.142 |
| 4389.4000001 | 1.092 |
| 4392.70000005 | 0.986 |
| 4395.79999995 | 1.112 |
| 4399.29999995 | 1.076 |
| 4402.4000001 | 1.077 |
| 4405.5999999 | 1.069 |
| 4408.9000001 | 1.028 |
| 4412.0 | 1.132 |
| 4415.29999995 | 1.056 |
| 4418.5 | 1.049 |
| 4421.9000001 | 0.972 |
| 4424.9000001 | 1.062 |
| 4427.9000001 | 1.014 |
| 4431.0 | 0.89 |
| 4434.0 | 1.166 |
| 4437.20000005 | 1.083 |
| 4440.4000001 | 1.049 |
| 4443.70000005 | 1.056 |
| 4447.0999999 | 1.042 |
| 4450.29999995 | 1.014 |
| 4453.29999995 | 1.099 |
| 4456.4000001 | 0.993 |
| 4459.70000005 | 0.951 |
| 4462.70000005 | 1.105 |
| 4465.9000001 | 1.07 |
| 4469.0999999 | 1.063 |
| 4472.29999995 | 1.028 |
| 4475.5 | 1.063 |
| 4478.9000001 | 1.035 |
| 4481.9000001 | 0.986 |
| 4484.9000001 | 1.085 |
| 4488.0999999 | 1.05 |
| 4491.5 | 1.121 |
| 4494.70000005 | 1 |
| 4497.70000005 | 0.858 |
| 4500.70000005 | 1.05 |
| 4503.9000001 | 0.95 |
| 4506.9000001 | 1.17 |
| 4510.0999999 | 1.112 |
| 4513.29999995 | 1.035 |
| 4516.5 | 1.021 |
| 4519.70000005 | 1.083 |
| 4522.70000005 | 1.124 |
| 4525.70000005 | 1.159 |
| 4528.9000001 | 1.118 |
| 4532.0999999 | 1.139 |
| 4535.29999995 | 1.007 |
| 4538.0999999 | 1.326 |
| 4541.29999995 | 1.172 |
| 4544.5 | 1.179 |
| 4547.5 | 1.028 |
| 4550.9000001 | 1.188 |
| 4553.9000001 | 0.979 |
| 4556.9000001 | 1 |
| 4560.0999999 | 1.111 |
| 4562.70000005 | 1.111 |
| 4565.29999995 | 1.169 |
| 4568.5 | 1.22 |
| 4571.5 | 1.07 |
| 4574.9000001 | 1.056 |
| 4577.9000001 | 1.021 |
| 4581.0 | 0.944 |
| 4584.29999995 | 0.993 |
| 4587.5 | 0.986 |
| 4590.5 | 0.887 |
| 4593.70000005 | 1.085 |
| 4596.9000001 | 1.029 |
| 4600.29999995 | 0.921 |
| 4603.5 | 1.087 |
| 4606.70000005 | 0.993 |
| 4610.0999999 | 0.957 |
| 4613.5 | 0.942 |
| 4616.9000001 | 0.906 |
| 4620.0999999 | 0.935 |
| 4623.5 | 0.712 |
| 4626.70000005 | 0.899 |
| 4629.9000001 | 0.826 |
| 4633.0999999 | 0.986 |
| 4636.5 | 0.855 |
| 4639.5 | 1.036 |
| 4642.70000005 | 0.937 |
| 4646.0999999 | 0.938 |
| 4649.5 | 0.681 |
| 4653.5 | 0.853 |
| 4657.70000005 | 0.872 |
| 4661.9000001 | 0.814 |
| 4665.9000001 | 0.95 |
| 4670.29999995 | 0.92 |
| 4674.70000005 | 0.877 |
| 4678.9000001 | 0.941 |
| 4683.0 | 0.934 |
| 4687.29999995 | 0.83 |
| 4691.29999995 | 0.867 |
| 4695.5 | 0.933 |
| 4699.9000001 | 0.903 |
| 4704.0999999 | 0.896 |
| 4708.5 | 0.88 |
| 4712.29999995 | 0.85 |
| 4715.9000001 | 1.008 |
| 4719.9000001 | 0.917 |
| 4723.70000005 | 0.993 |
| 4727.5 | 0.949 |
| 4731.0999999 | 0.935 |
| 4735.0999999 | 0.913 |
| 4738.70000005 | 0.87 |
| 4742.9000001 | 0.847 |
| 4746.5 | 0.918 |
| 4750.29999995 | 0.902 |
| 4753.9000001 | 0.992 |
| 4757.9000001 | 0.977 |
| 4761.70000005 | 0.977 |
| 4765.29999995 | 0.925 |
| 4769.0999999 | 1 |
| 4773.29999995 | 1.007 |
| 4777.70000005 | 0.97 |
| 4781.9000001 | 1.053 |
| 4785.9000001 | 1 |
| 4789.9000001 | 0.911 |
| 4793.9000001 | 1.022 |
| 4797.70000005 | 1.029 |
| 4801.70000005 | 0.964 |
| 4806.0 | 0.892 |
| 4809.5 | 0.885 |
| 4813.29999995 | 0.914 |
| 4817.0999999 | 0.928 |
| 4820.9000001 | 0.848 |
| 4824.5 | 0.891 |
| 4828.0999999 | 0.963 |
| 4831.9000001 | 0.919 |
| 4835.5 | 0.934 |
| 4839.5 | 0.949 |
| 4843.5 | 0.978 |
| 4847.29999995 | 1.037 |
| 4851.20000005 | 1 |
| 4855.0999999 | 1.015 |
| 4859.29999995 | 1.029 |
| 4863.5 | 1.029 |
| 4867.5 | 0.921 |
| 4871.29999995 | 0.899 |
| 4875.0 | 1.029 |
| 4878.9000001 | 0.928 |
| 4882.70000005 | 0.784 |
| 4886.29999995 | 0.964 |
| 4890.0999999 | 0.964 |
| 4893.9000001 | 0.906 |
| 4897.5 | 1.036 |
| 4901.29999995 | 0.964 |
| 4904.9000001 | 0.936 |
| 4908.9000001 | 0.942 |
| 4912.5 | 0.964 |
| 4916.29999995 | 1 |
| 4920.0 | 0.949 |
| 4923.9000001 | 0.942 |
| 4927.70000005 | 1.022 |
| 4931.5 | 0.92 |
| 4934.9000001 | 0.856 |
| 4938.70000005 | 0.755 |
| 4942.29999995 | 0.555 |
| 4946.29999995 | 0.43 |
| 4946.29999995 | 0.43 |